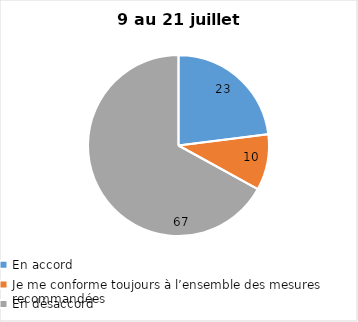
| Category | Series 0 |
|---|---|
| En accord | 23 |
| Je me conforme toujours à l’ensemble des mesures recommandées | 10 |
| En désaccord | 67 |